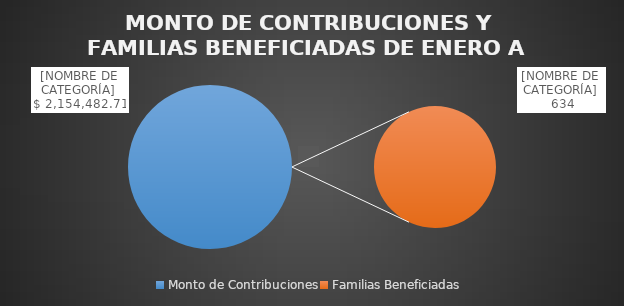
| Category | Series 0 |
|---|---|
| Monto de Contribuciones | 2154482.71 |
| Familias Beneficiadas | 634 |